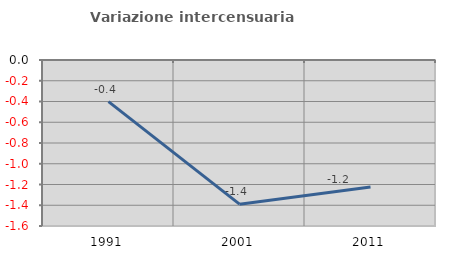
| Category | Variazione intercensuaria annua |
|---|---|
| 1991.0 | -0.401 |
| 2001.0 | -1.39 |
| 2011.0 | -1.224 |